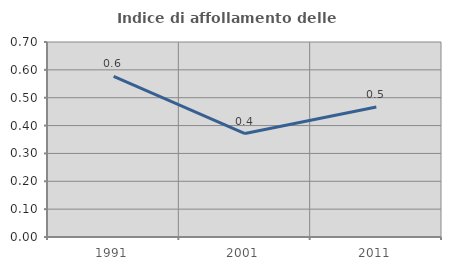
| Category | Indice di affollamento delle abitazioni  |
|---|---|
| 1991.0 | 0.576 |
| 2001.0 | 0.372 |
| 2011.0 | 0.467 |